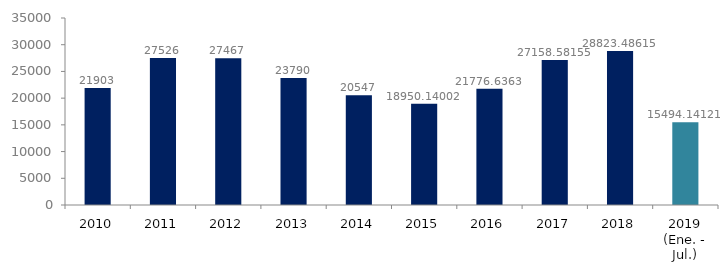
| Category | Series 1 |
|---|---|
| 2010 | 21903 |
| 2011 | 27526 |
| 2012 | 27467 |
| 2013 | 23790 |
| 2014 | 20547 |
| 2015 | 18950.14 |
| 2016 | 21776.636 |
| 2017 | 27158.582 |
| 2018 | 28823.486 |
| 2019 (Ene. - Jul.) | 15494.141 |